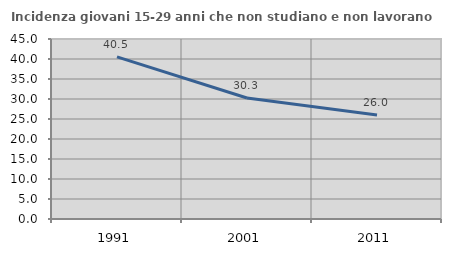
| Category | Incidenza giovani 15-29 anni che non studiano e non lavorano  |
|---|---|
| 1991.0 | 40.541 |
| 2001.0 | 30.263 |
| 2011.0 | 26.007 |